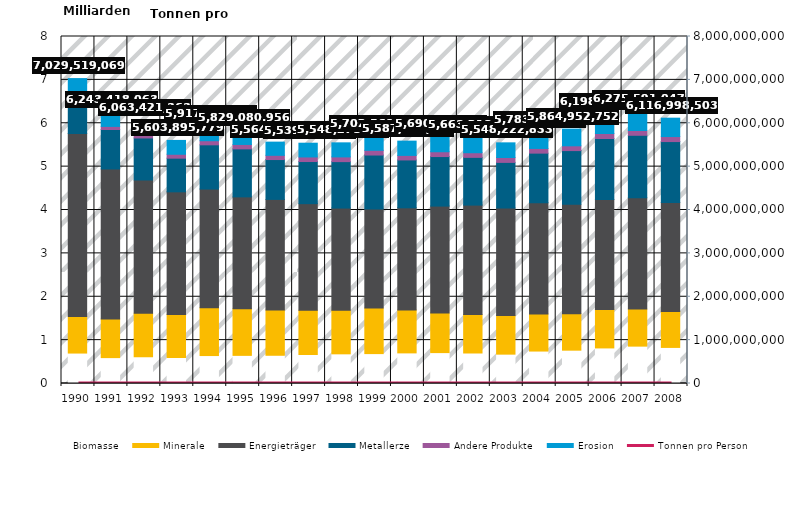
| Category | Biomasse | Minerale | Energieträger | Metallerze | Andere Produkte | Erosion |
|---|---|---|---|---|---|---|
| 1990.0 | 701795738 | 844039339.616 | 4217929524.04 | 874924008.859 | 60767696.182 | 330062762.56 |
| 1991.0 | 596808323.807 | 892590390.528 | 3456757281.978 | 909524083.161 | 71481460.622 | 316256523.767 |
| 1992.0 | 618888724.795 | 1002781429.454 | 3071171552.951 | 967641570.954 | 82372271.85 | 320565813.848 |
| 1993.0 | 602234280.606 | 987769980.453 | 2828810967.894 | 776264643.223 | 89769852.027 | 319046055.112 |
| 1994.0 | 644101189.742 | 1104348394.706 | 2734469030.906 | 1019804341.301 | 94534307.499 | 319933706.127 |
| 1995.0 | 648644281.438 | 1076977186.226 | 2576928322.283 | 1106749858.94 | 101704478.304 | 318076829.348 |
| 1996.0 | 650866858.885 | 1043592313.107 | 2550191476.52 | 918368767.364 | 97669256.01 | 304048817.987 |
| 1997.0 | 668217568.289 | 1020630735.063 | 2457152623.681 | 971423555.756 | 105527474.072 | 316840520.506 |
| 1998.0 | 683966823.787 | 1005344951.949 | 2355389775.549 | 1070621027.831 | 108760286.696 | 324195342.242 |
| 1999.0 | 689269717.297 | 1049558672.148 | 2286394931.228 | 1242049033.562 | 108734987.321 | 326561710.596 |
| 2000.0 | 705798586.285 | 989871442.466 | 2354602755.843 | 1103628978.176 | 104616673.255 | 329350791.373 |
| 2001.0 | 712279749.657 | 914508339.6 | 2463340968.48 | 1142152873.548 | 110686274.922 | 347266591.692 |
| 2002.0 | 703269937.385 | 887129102.143 | 2522312651.229 | 1100848774.494 | 106730335.158 | 342922916.931 |
| 2003.0 | 676650327.875 | 888850429.027 | 2480260161.81 | 1051887511.08 | 113077519.522 | 337496884.263 |
| 2004.0 | 747937892.112 | 856032835.365 | 2562369793.533 | 1144642665.132 | 108218950.438 | 364454394.741 |
| 2005.0 | 768392504.678 | 840413355.126 | 2523305781.889 | 1237480016.033 | 109982153.595 | 385378941.556 |
| 2006.0 | 820088898.812 | 884438340.326 | 2535645787.181 | 1408479350.962 | 114918347.916 | 434857752.544 |
| 2007.0 | 861577431.185 | 853743545.699 | 2566949348.267 | 1440426991.185 | 109711109.179 | 443182622.285 |
| 2008.0 | 831798864.893 | 830783499.388 | 2509990994.429 | 1405080421.608 | 115243628.762 | 424101094.443 |